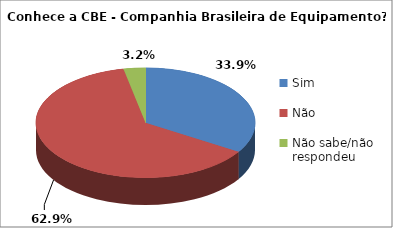
| Category | Series 0 |
|---|---|
| Sim | 42 |
| Não | 78 |
| Não sabe/não respondeu | 4 |